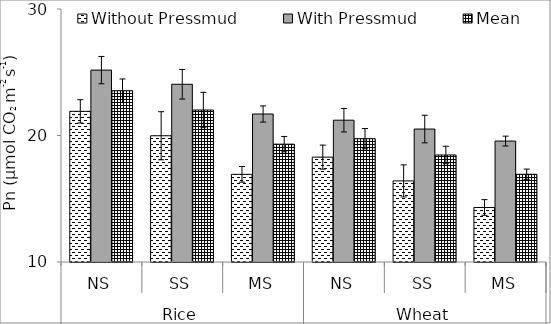
| Category | Without Pressmud | With Pressmud | Mean |
|---|---|---|---|
| 0 | 21.91 | 25.17 | 23.54 |
| 1 | 19.98 | 24.05 | 22.015 |
| 2 | 16.93 | 21.7 | 19.315 |
| 3 | 18.29 | 21.21 | 19.75 |
| 4 | 16.41 | 20.51 | 18.46 |
| 5 | 14.31 | 19.56 | 16.935 |